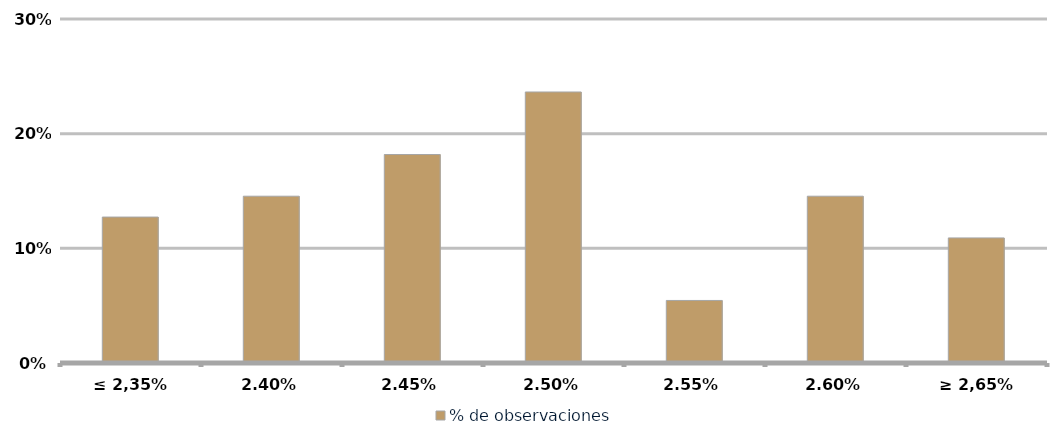
| Category | % de observaciones  |
|---|---|
| ≤ 2,35% | 0.127 |
| 2,40% | 0.145 |
| 2,45% | 0.182 |
| 2,50% | 0.236 |
| 2,55% | 0.055 |
| 2,60% | 0.145 |
| ≥ 2,65% | 0.109 |